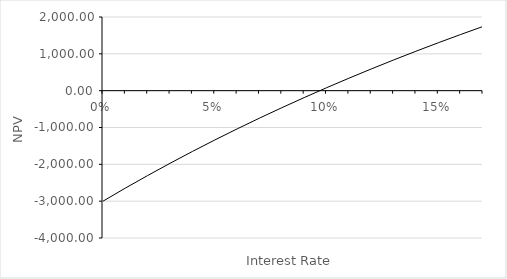
| Category | NPV |
|---|---|
| 0.0 | -3000 |
| 0.01 | -2645.911 |
| 0.02 | -2303.3 |
| 0.03 | -1971.668 |
| 0.04 | -1650.546 |
| 0.05 | -1339.488 |
| 0.060000000000000005 | -1038.072 |
| 0.07 | -745.896 |
| 0.08 | -462.582 |
| 0.09 | -187.768 |
| 0.09999999999999999 | 78.888 |
| 0.10999999999999999 | 337.712 |
| 0.11999999999999998 | 589.012 |
| 0.12999999999999998 | 833.084 |
| 0.13999999999999999 | 1070.208 |
| 0.15 | 1300.649 |
| 0.16 | 1524.663 |
| 0.17 | 1742.49 |